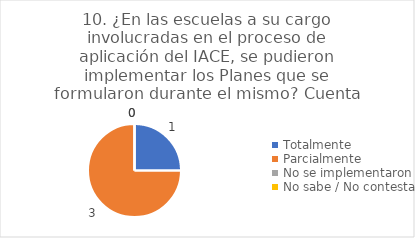
| Category | 10. ¿En las escuelas a su cargo involucradas en el proceso de aplicación del IACE, se pudieron implementar los Planes que se formularon durante el mismo? |
|---|---|
| Totalmente  | 0.25 |
| Parcialmente  | 0.75 |
| No se implementaron  | 0 |
| No sabe / No contesta | 0 |